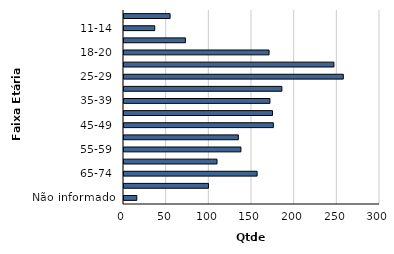
| Category | Qtde Vítimas |
|---|---|
| Não informado | 15 |
| 75+ | 99 |
| 65-74 | 156 |
| 60-64 | 109 |
| 55-59 | 137 |
| 50-54 | 134 |
| 45-49 | 175 |
| 40-44 | 174 |
| 35-39 | 171 |
| 30-34 | 185 |
| 25-29 | 257 |
| 21-24 | 246 |
| 18-20 | 170 |
| 15-17 | 72 |
| 11-14 | 36 |
| 0-10 | 54 |